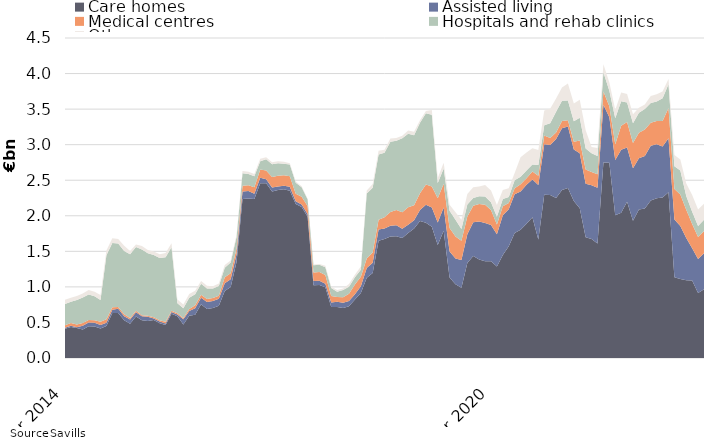
| Category | Care homes | Assisted living | Medical centres | Hospitals and rehab clinics | Other |
|---|---|---|---|---|---|
| 2014-03-01 | 409587999 | 16996000 | 33896100 | 297467994 | 60915344 |
| 2014-04-01 | 436479999 | 16996000 | 38896100 | 299927994 | 54915344 |
| 2014-05-01 | 420451999 | 12372000 | 38896100 | 345627991 | 54915344 |
| 2014-06-01 | 400251999 | 53047000 | 38896100 | 360127987 | 54915344 |
| 2014-07-01 | 447606996 | 53047000 | 35000000 | 357127989 | 63009744 |
| 2014-08-01 | 442116996 | 53047000 | 35000000 | 337739742 | 63009744 |
| 2014-09-01 | 416316995 | 46247000 | 47499999 | 307299740 | 67509743 |
| 2014-10-01 | 450246995 | 46247000 | 47499999 | 901299740 | 65760544 |
| 2014-11-01 | 633736081 | 43759854 | 35999999 | 904699738 | 65760544 |
| 2014-12-01 | 633736081 | 57759854 | 25749999 | 891599738 | 64340644 |
| 2015-01-01 | 530736081 | 57759854 | 25749999 | 891599738 | 71465644 |
| 2015-02-01 | 483168082 | 57759854 | 20749999 | 896099737 | 47465644 |
| 2015-03-01 | 584248082 | 57759854 | 20749999 | 897080987 | 35574599 |
| 2015-04-01 | 529356082 | 57759854 | 15749999 | 924420986 | 46426599 |
| 2015-05-01 | 520608080 | 57759854 | 15749999 | 878720989 | 46426599 |
| 2015-06-01 | 533256112 | 23084854 | 15749999 | 876900990 | 49446599 |
| 2015-07-01 | 490421115 | 23084854 | 15749999 | 875398489 | 52902199 |
| 2015-08-01 | 463331115 | 23084854 | 22535999 | 907658735 | 59202199 |
| 2015-09-01 | 621256115 | 25684854 | 16839999 | 894158738 | 54702200 |
| 2015-10-01 | 587326115 | 25684854 | 16839999 | 139658736 | 52047000 |
| 2015-11-01 | 471877887 | 72825922 | 16839999 | 139508737 | 52047000 |
| 2015-12-01 | 593556246 | 68890922 | 27614999 | 157908739 | 52496999 |
| 2016-01-01 | 606656246 | 93190922 | 41614999 | 153408740 | 50721998 |
| 2016-02-01 | 754539246 | 93190922 | 41614999 | 153858740 | 39721998 |
| 2016-03-01 | 687824246 | 98850422 | 41614999 | 149377489 | 39721998 |
| 2016-04-01 | 701548246 | 98850422 | 41614999 | 136827489 | 28869998 |
| 2016-05-01 | 734016248 | 98850422 | 41614999 | 136827489 | 37869998 |
| 2016-06-01 | 941523216 | 109570422 | 83842999 | 134147490 | 39449998 |
| 2016-07-01 | 997563216 | 109570422 | 83842999 | 153319989 | 28209997 |
| 2016-08-01 | 1353063216 | 109570422 | 80368999 | 163139991 | 26909995 |
| 2016-09-01 | 2236038217 | 106970422 | 78890000 | 174533091 | 31909995 |
| 2016-10-01 | 2242038217 | 106970422 | 78890000 | 160033093 | 30909995 |
| 2016-11-01 | 2237654905 | 70446953 | 92390000 | 156208094 | 32409994 |
| 2016-12-01 | 2458976545 | 74801952 | 115752000 | 118658093 | 33459994 |
| 2017-01-01 | 2457326544 | 55001951 | 125059800 | 158158090 | 28109995 |
| 2017-02-01 | 2342511544 | 55001951 | 149359800 | 178733089 | 28109995 |
| 2017-03-01 | 2363283207 | 49342451 | 149359800 | 177233090 | 28109995 |
| 2017-04-01 | 2371659207 | 49792450 | 149359800 | 159983091 | 28109995 |
| 2017-05-01 | 2351709207 | 54792450 | 149359800 | 164483090 | 19109995 |
| 2017-06-01 | 2165904207 | 38072450 | 107131800 | 154483091 | 16259995 |
| 2017-07-01 | 2122064206 | 38072450 | 107131800 | 133313092 | 14749996 |
| 2017-08-01 | 1987264211 | 38072450 | 111838800 | 93893091 | 9749998 |
| 2017-09-01 | 1022249210 | 59156450 | 121613798 | 101239339 | 11749996 |
| 2017-10-01 | 1028249210 | 59156450 | 122794094 | 101239339 | 11749996 |
| 2017-11-01 | 993351664 | 51823997 | 121994094 | 110189339 | 19607117 |
| 2017-12-01 | 717528269.65 | 64485392.34 | 91375634 | 109439340 | 20394618 |
| 2018-01-01 | 716093269.65 | 73735393.34 | 68067834 | 74639342 | 22894617 |
| 2018-02-01 | 702731268.65 | 75083233.34 | 76967834 | 100209344 | 22894617 |
| 2018-03-01 | 726239605.65 | 75083233.34 | 101967834 | 100209344 | 37894617 |
| 2018-04-01 | 823219606.65 | 74633234.34 | 134166234 | 102309343 | 37894617 |
| 2018-05-01 | 915642106.65 | 94273234.34 | 134166234 | 97809344 | 43894617 |
| 2018-06-01 | 1127762106.65 | 138273234.34 | 134166234 | 912809344 | 42144617 |
| 2018-07-01 | 1195392105.65 | 143673234.34 | 145666234 | 910309345 | 51944617 |
| 2018-08-01 | 1648382098.65 | 157723234.34 | 137647234 | 919564346 | 51944617 |
| 2018-09-01 | 1672277099.66 | 147639234.34 | 158043236 | 907324998 | 44944619 |
| 2018-10-01 | 1707357099.66 | 151089234.34 | 195391740 | 988324994 | 44944619 |
| 2018-11-01 | 1711797099.66 | 155979234.34 | 214712300 | 974149994 | 37837498 |
| 2018-12-01 | 1689070494.01 | 128897840 | 232943760 | 1040049993 | 35549998 |
| 2019-01-01 | 1756635495.01 | 115597839 | 246203760 | 1035349994 | 46839999 |
| 2019-02-01 | 1821157496.01 | 114249999 | 213003760 | 985490494 | 46839999 |
| 2019-03-01 | 1925204184.01 | 156848310 | 233003760 | 994090494 | 33089999 |
| 2019-04-01 | 1902076683.01 | 251948310 | 285155359 | 1002880494 | 33089999 |
| 2019-05-01 | 1844150183.01 | 271883310 | 295091359 | 1009130493 | 65889999 |
| 2019-06-01 | 1589330183.01 | 317883310 | 338910558 | 213630492 | 71139999 |
| 2019-07-01 | 1791050185.01 | 326550262 | 332410558 | 213630492 | 83739997 |
| 2019-08-01 | 1133390186.01 | 363547512 | 332410558 | 240875492 | 83739997 |
| 2019-09-01 | 1035775186 | 363547512 | 308580808 | 235521492 | 105439996 |
| 2019-10-01 | 988695186 | 389797512 | 270052008 | 166221496 | 128973996 |
| 2019-11-01 | 1337476185 | 403512512 | 250531448 | 166518696 | 147173996 |
| 2019-12-01 | 1436021186 | 471912512 | 231531448 | 110118696 | 150234746 |
| 2020-01-01 | 1386087141 | 533140013 | 245211448 | 110118696 | 137444745 |
| 2020-02-01 | 1358892933.36 | 541184833 | 256248136 | 114033196 | 162444745 |
| 2020-03-01 | 1359571245.36 | 509586522 | 211248136 | 109933195 | 164594745 |
| 2020-04-01 | 1285138745.36 | 455118522 | 136898136 | 108543196 | 164594745 |
| 2020-05-01 | 1447483164.36 | 559543521.96 | 126962136 | 102293197 | 125794745 |
| 2020-06-01 | 1572243164.36 | 518143521.96 | 89556937 | 82793198 | 124044744 |
| 2020-07-01 | 1757903270.73 | 545381569.96 | 84556937 | 113523198 | 101644746 |
| 2020-08-01 | 1803513271.73 | 538816589.45 | 102061337 | 103523197 | 274144745 |
| 2020-09-01 | 1888440256.54 | 547632192.28 | 90395087 | 109677196 | 252444746 |
| 2020-10-01 | 1978180292 | 533682192.28 | 111995087 | 97977196 | 228910746 |
| 2020-11-01 | 1665039293 | 767307192.28 | 130112487 | 152879995 | 208460747 |
| 2020-12-01 | 2294464292.86 | 710807192.28 | 124112487 | 143379996 | 207709997 |
| 2021-01-01 | 2291797829.77 | 704629692.28 | 97172487 | 205879995 | 206709998 |
| 2021-02-01 | 2251486125.17 | 827692871.28 | 93575799 | 290996995 | 185699998 |
| 2021-03-01 | 2364136125.17 | 868373933.64 | 100275799 | 286496996 | 184924998 |
| 2021-04-01 | 2389616124.17 | 864137936.64 | 90275800 | 276996996 | 240479998 |
| 2021-05-01 | 2208345705.17 | 724537936.68 | 108436800 | 287996996 | 249129998 |
| 2021-06-01 | 2107366705.17 | 772837936.68 | 176636800 | 321096995 | 253629997 |
| 2021-07-01 | 1698576598.8 | 753200536.68 | 199216800 | 296675495 | 253629997 |
| 2021-08-01 | 1673497598.8 | 755702523.19 | 185212400 | 265675496 | 87993998 |
| 2021-09-01 | 1610965613.99 | 782639920.36 | 190342400 | 258375497 | 111193997 |
| 2021-10-01 | 2750841584.78 | 812109920.36 | 184742400 | 269475497 | 114793997 |
| 2021-11-01 | 2745941584.78 | 639669920.36 | 154125000 | 219275497 | 114793997 |
| 2021-12-01 | 2006821584.92 | 777519920.36 | 221765800 | 364207997 | 118483997 |
| 2022-01-01 | 2042127093.01 | 886132354.36 | 337795799 | 344707998 | 122995997 |
| 2022-02-01 | 2196388858.57 | 762224355.36 | 361855798 | 271440998 | 120005996 |
| 2022-03-01 | 1928563857.57 | 739468293 | 355155798 | 276440998 | 127580995 |
| 2022-04-01 | 2088421001.57 | 719072290 | 361030798 | 279620998 | 72025995 |
| 2022-05-01 | 2102802501.57 | 737309790 | 373877298 | 286620998 | 63375995 |
| 2022-06-01 | 2216266501.57 | 768629139 | 324546350.59 | 278245999 | 95975997 |
| 2022-07-01 | 2244765054.57 | 762589744 | 326355100.59 | 271937499 | 103652497 |
| 2022-08-01 | 2257556327.57 | 715605488 | 358855100.59 | 320237499 | 96788497 |
| 2022-09-01 | 2331781592.07 | 760059931.47 | 423725100.57 | 332737499 | 73588498 |
| 2022-10-01 | 1135340585.82 | 811976096.45 | 428725100.57 | 321637499 | 157293498 |
| 2022-11-01 | 1111825545.82 | 744216096.45 | 442525100.57 | 336637500 | 157293498 |
| 2022-12-01 | 1093347679.82 | 594466096.45 | 397384300.57 | 193505000 | 176293498 |
| 2023-01-01 | 1090322679.82 | 454293662.45 | 341155301.57 | 170004998 | 235031498 |
| 2023-02-01 | 914306826.5 | 476193662.45 | 312254502.57 | 153004998 | 234031499 |
| 2023-03-01 | 968021827.5 | 505160662.45 | 312254502.57 | 160127498 | 223831500 |